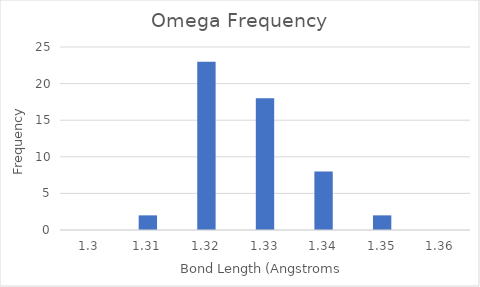
| Category | Omega |
|---|---|
| 1.3 | 0 |
| 1.31 | 2 |
| 1.32 | 23 |
| 1.33 | 18 |
| 1.34 | 8 |
| 1.35 | 2 |
| 1.36 | 0 |